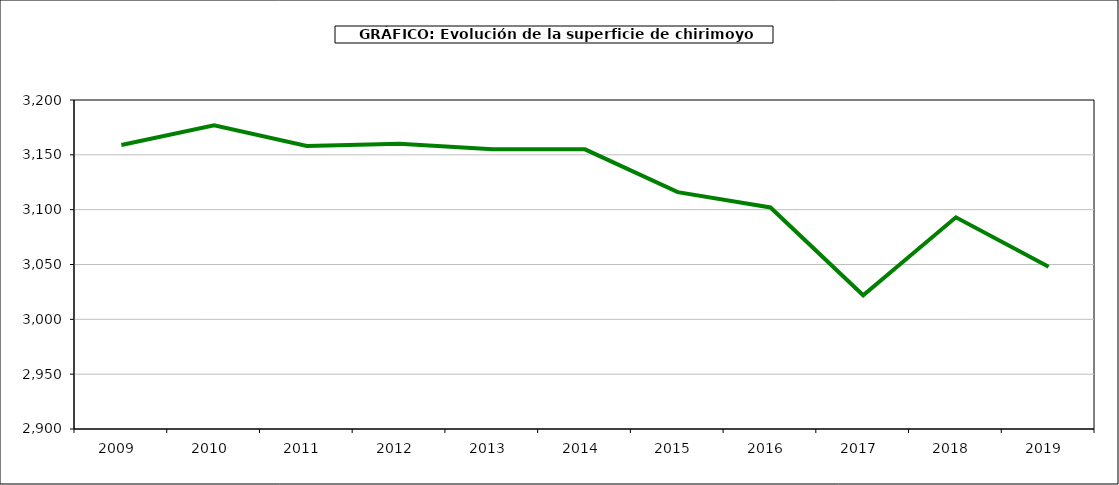
| Category | superficie chirimoyo |
|---|---|
| 2009.0 | 3159 |
| 2010.0 | 3177 |
| 2011.0 | 3158 |
| 2012.0 | 3160 |
| 2013.0 | 3155 |
| 2014.0 | 3155 |
| 2015.0 | 3116 |
| 2016.0 | 3102 |
| 2017.0 | 3022 |
| 2018.0 | 3093 |
| 2019.0 | 3048 |